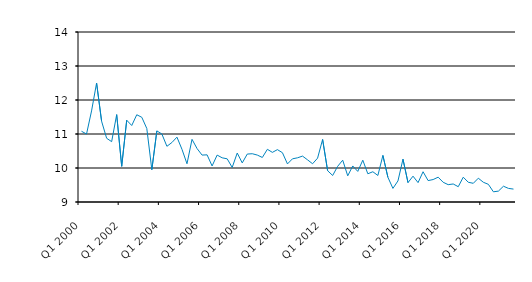
| Category | Series 0 |
|---|---|
| Q1 2000 | 11.08 |
| Q2 2000 | 11 |
| Q3 2000 | 11.679 |
| Q4 2000 | 12.5 |
| Q1 2001 | 11.375 |
| Q2 2001 | 10.875 |
| Q3 2001 | 10.775 |
| Q4 2001 | 11.57 |
| Q1 2002 | 10.05 |
| Q2 2002 | 11.405 |
| Q3 2002 | 11.25 |
| Q4 2002 | 11.566 |
| Q1 2003 | 11.492 |
| Q2 2003 | 11.162 |
| Q3 2003 | 9.95 |
| Q4 2003 | 11.091 |
| Q1 2004 | 11 |
| Q2 2004 | 10.638 |
| Q3 2004 | 10.75 |
| Q4 2004 | 10.908 |
| Q1 2005 | 10.55 |
| Q2 2005 | 10.125 |
| Q3 2005 | 10.843 |
| Q4 2005 | 10.573 |
| Q1 2006 | 10.38 |
| Q2 2006 | 10.387 |
| Q3 2006 | 10.06 |
| Q4 2006 | 10.38 |
| Q1 2007 | 10.3 |
| Q2 2007 | 10.27 |
| Q3 2007 | 10.017 |
| Q4 2007 | 10.44 |
| Q1 2008 | 10.15 |
| Q2 2008 | 10.41 |
| Q3 2008 | 10.42 |
| Q4 2008 | 10.38 |
| Q1 2009 | 10.31 |
| Q2 2009 | 10.55 |
| Q3 2009 | 10.46 |
| Q4 2009 | 10.54 |
| Q1 2010 | 10.45 |
| Q2 2010 | 10.12 |
| Q3 2010 | 10.27 |
| Q4 2010 | 10.3 |
| Q1 2011 | 10.35 |
| Q2 2011 | 10.24 |
| Q3 2011 | 10.125 |
| Q4 2011 | 10.29 |
| Q1 2012 | 10.84 |
| Q2 2012 | 9.92 |
| Q3 2012 | 9.78 |
| Q4 2012 | 10.05 |
| Q1 2013 | 10.23 |
| Q2 2013 | 9.77 |
| Q3 2013 | 10.06 |
| Q4 2013 | 9.9 |
| Q1 2014 | 10.23 |
| Q2 2014 | 9.83 |
| Q3 2014 | 9.89 |
| Q4 2014 | 9.78 |
| Q1 2015 | 10.37 |
| Q2 2015 | 9.726 |
| Q3 2015 | 9.4 |
| Q4 2015 | 9.62 |
| Q1 2016 | 10.26 |
| Q2 2016 | 9.57 |
| Q3 2016 | 9.76 |
| Q4 2016 | 9.57 |
| Q1 2017 | 9.89 |
| Q2 2017 | 9.63 |
| Q3 2017 | 9.66 |
| Q4 2017 | 9.73 |
| Q1 2018 | 9.58 |
| Q2 2018 | 9.51 |
| Q3 2018 | 9.53 |
| Q4 2018 | 9.45 |
| Q1 2019 | 9.73 |
| Q2 2019 | 9.58 |
| Q3 2019 | 9.55 |
| Q4 2019 | 9.7 |
| Q1 2020 | 9.58 |
| Q2 2020 | 9.52 |
| Q3 2020 | 9.3 |
| Q4 2020 | 9.32 |
| Q1 2021 | 9.464 |
| Q2 2021 | 9.4 |
| Q3 2021 | 9.38 |